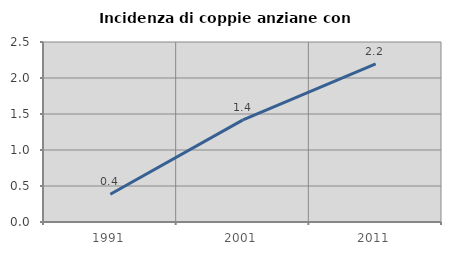
| Category | Incidenza di coppie anziane con figli |
|---|---|
| 1991.0 | 0.386 |
| 2001.0 | 1.418 |
| 2011.0 | 2.198 |